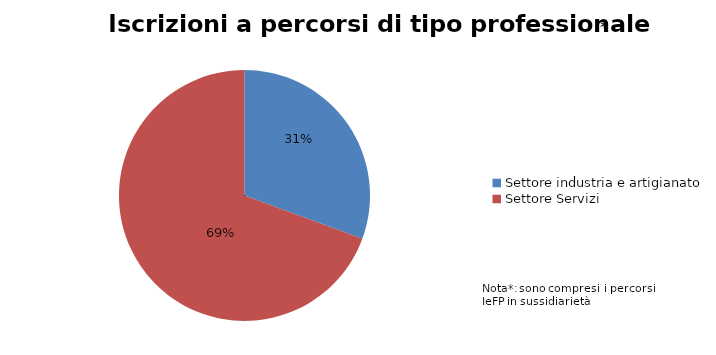
| Category | Series 0 |
|---|---|
| Settore industria e artigianato | 2025 |
| Settore Servizi | 4594 |